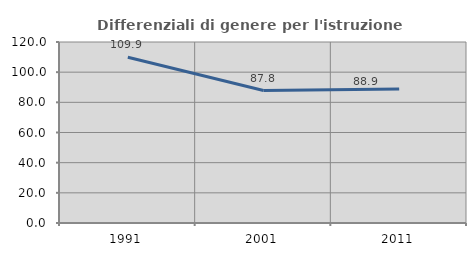
| Category | Differenziali di genere per l'istruzione superiore |
|---|---|
| 1991.0 | 109.913 |
| 2001.0 | 87.793 |
| 2011.0 | 88.917 |